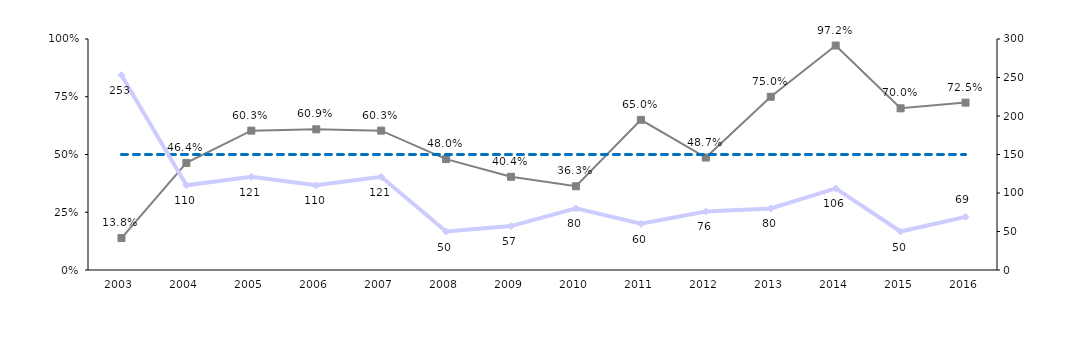
| Category | % Upgrades | Upgrades = Downgrades |
|---|---|---|
| 2003.0 | 0.138 | 0.5 |
| 2004.0 | 0.464 | 0.5 |
| 2005.0 | 0.603 | 0.5 |
| 2006.0 | 0.609 | 0.5 |
| 2007.0 | 0.603 | 0.5 |
| 2008.0 | 0.48 | 0.5 |
| 2009.0 | 0.404 | 0.5 |
| 2010.0 | 0.362 | 0.5 |
| 2011.0 | 0.65 | 0.5 |
| 2012.0 | 0.487 | 0.5 |
| 2013.0 | 0.75 | 0.5 |
| 2014.0 | 0.972 | 0.5 |
| 2015.0 | 0.7 | 0.5 |
| 2016.0 | 0.725 | 0.5 |